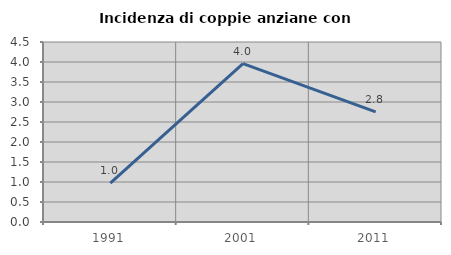
| Category | Incidenza di coppie anziane con figli |
|---|---|
| 1991.0 | 0.971 |
| 2001.0 | 3.96 |
| 2011.0 | 2.752 |